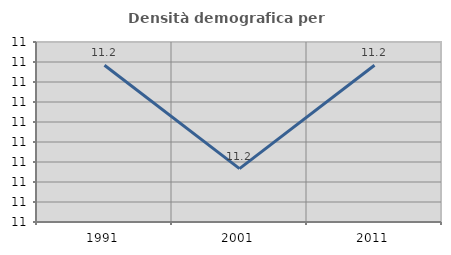
| Category | Densità demografica |
|---|---|
| 1991.0 | 11.218 |
| 2001.0 | 11.213 |
| 2011.0 | 11.218 |